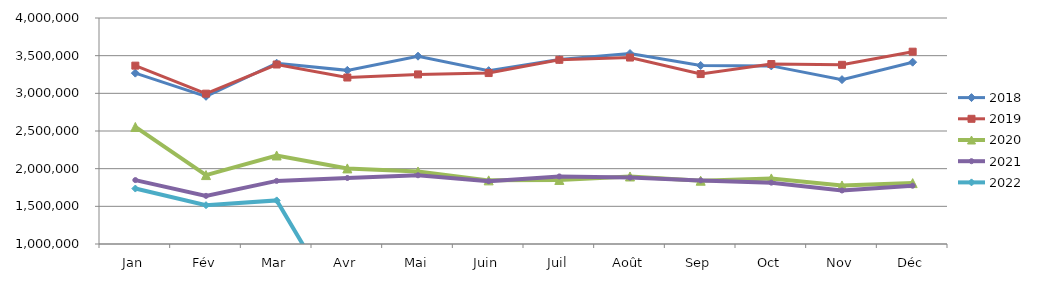
| Category | 2018 | 2019 | 2020 | 2021 | 2022 |
|---|---|---|---|---|---|
| Jan | 3268127.156 | 3367510.542 | 2553542.465 | 1848435.265 | 1735995.843 |
| Fév | 2960518.709 | 2995707.194 | 1914783.421 | 1639009.953 | 1515103.941 |
| Mar | 3399788.443 | 3382590.899 | 2175089.683 | 1837369.769 | 1578824.422 |
| Avr | 3304906.324 | 3209954.832 | 2003293.895 | 1876404.979 | 0 |
| Mai | 3492911.082 | 3251146.092 | 1962510.702 | 1912345.285 | 0 |
| Juin | 3300924.802 | 3269085.474 | 1844603.728 | 1833702.622 | 0 |
| Juil | 3448603.566 | 3445052.713 | 1850370.172 | 1896825.197 | 0 |
| Août | 3528173.012 | 3474993.525 | 1896365.756 | 1881267.945 | 0 |
| Sep | 3369626.193 | 3255644.054 | 1840205.182 | 1844525.749 | 0 |
| Oct | 3364260.879 | 3388972.2 | 1870450.237 | 1814485.706 | 0 |
| Nov | 3181888.576 | 3378477.919 | 1777011.858 | 1710700.553 | 0 |
| Déc | 3413454.996 | 3552894.26 | 1808480.012 | 1774263.924 | 0 |